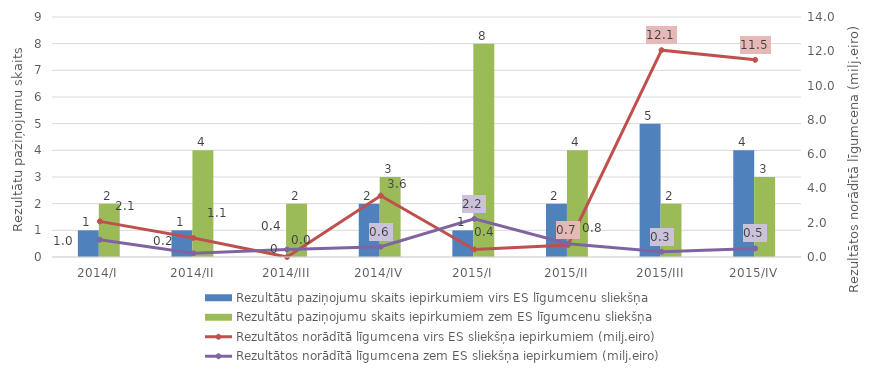
| Category | Rezultātu paziņojumu skaits iepirkumiem virs ES līgumcenu sliekšņa | Rezultātu paziņojumu skaits iepirkumiem zem ES līgumcenu sliekšņa |
|---|---|---|
| 2014/I | 1 | 2 |
| 2014/II | 1 | 4 |
| 2014/III | 0 | 2 |
| 2014/IV | 2 | 3 |
| 2015/I | 1 | 8 |
| 2015/II | 2 | 4 |
| 2015/III | 5 | 2 |
| 2015/IV | 4 | 3 |